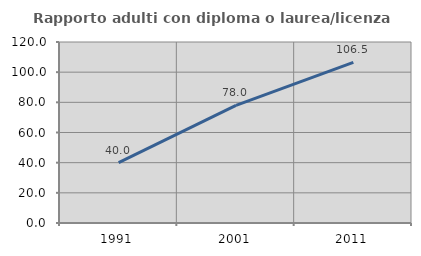
| Category | Rapporto adulti con diploma o laurea/licenza media  |
|---|---|
| 1991.0 | 40 |
| 2001.0 | 78 |
| 2011.0 | 106.522 |